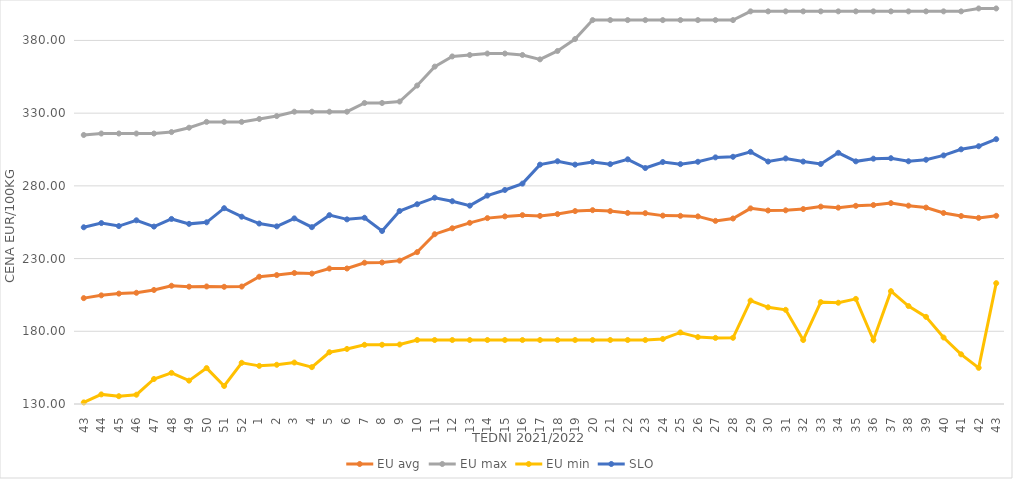
| Category | EU avg | EU max | EU min | SLO |
|---|---|---|---|---|
| 43.0 | 202.804 | 315 | 131.104 | 251.53 |
| 44.0 | 204.713 | 316 | 136.6 | 254.42 |
| 45.0 | 205.906 | 316 | 135.362 | 252.35 |
| 46.0 | 206.476 | 316 | 136.39 | 256.33 |
| 47.0 | 208.415 | 316 | 147.192 | 252.01 |
| 48.0 | 211.314 | 317 | 151.41 | 257.25 |
| 49.0 | 210.677 | 320 | 146.064 | 253.87 |
| 50.0 | 210.823 | 324 | 154.698 | 254.94 |
| 51.0 | 210.59 | 324 | 142.382 | 264.65 |
| 52.0 | 210.763 | 324 | 158.333 | 258.8 |
| 1.0 | 217.519 | 326 | 156.222 | 254.09 |
| 2.0 | 218.654 | 328 | 156.969 | 252.15 |
| 3.0 | 220.098 | 331 | 158.511 | 257.65 |
| 4.0 | 219.685 | 331 | 155.346 | 251.6 |
| 5.0 | 223.143 | 331 | 165.59 | 259.87 |
| 6.0 | 223.178 | 331 | 167.86 | 256.97 |
| 7.0 | 227.145 | 337 | 170.719 | 258.07 |
| 8.0 | 227.312 | 337 | 170.743 | 248.97 |
| 9.0 | 228.588 | 338 | 170.92 | 262.72 |
| 10.0 | 234.434 | 349 | 174 | 267.38 |
| 11.0 | 246.762 | 362 | 174 | 271.86 |
| 12.0 | 250.845 | 369 | 174 | 269.43 |
| 13.0 | 254.568 | 370 | 174 | 266.39 |
| 14.0 | 257.819 | 371 | 174 | 273.3 |
| 15.0 | 259 | 371 | 174 | 277.18 |
| 16.0 | 259.873 | 370 | 174 | 281.55 |
| 17.0 | 259.351 | 367 | 174 | 294.59 |
| 18.0 | 260.6 | 372.758 | 174 | 296.93 |
| 19.0 | 262.669 | 381 | 174 | 294.6 |
| 20.0 | 263.291 | 394 | 174 | 296.48 |
| 21.0 | 262.64 | 394 | 174 | 294.94 |
| 22.0 | 261.388 | 394 | 174 | 298.26 |
| 23.0 | 261.228 | 394 | 174 | 292.27 |
| 24.0 | 259.544 | 394 | 174.72 | 296.39 |
| 25.0 | 259.395 | 394 | 179.2 | 294.93 |
| 26.0 | 259.018 | 394 | 176 | 296.56 |
| 27.0 | 255.922 | 394 | 175.451 | 299.59 |
| 28.0 | 257.564 | 394 | 175.52 | 300.01 |
| 29.0 | 264.52 | 400 | 201.097 | 303.41 |
| 30.0 | 263.067 | 400 | 196.496 | 296.73 |
| 31.0 | 263.196 | 400 | 194.756 | 298.88 |
| 32.0 | 264.059 | 400 | 174 | 296.7 |
| 33.0 | 265.729 | 400 | 200.07 | 295.05 |
| 34.0 | 265.016 | 400 | 199.637 | 302.73 |
| 35.0 | 266.273 | 400 | 202.277 | 296.86 |
| 36.0 | 266.807 | 400 | 174 | 298.7 |
| 37.0 | 268.136 | 400 | 207.594 | 299.02 |
| 38.0 | 266.39 | 400 | 197.352 | 296.91 |
| 39.0 | 265.059 | 400 | 189.926 | 297.96 |
| 40.0 | 261.35 | 400 | 175.723 | 300.95 |
| 41.0 | 259.271 | 400 | 164.165 | 305.13 |
| 42.0 | 257.989 | 402 | 154.869 | 307.26 |
| 43.0 | 259.407 | 402 | 213.09 | 312.12 |